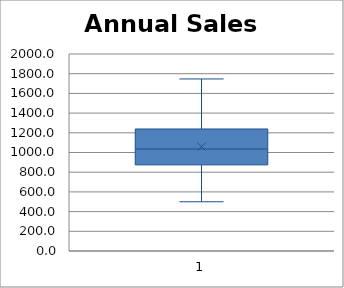
| Category | BachDeg% |
|---|---|
| 31.0 | 701.97 |
| 20.0 | 209.93 |
| 24.0 | 364.92 |
| 29.0 | 443.04 |
| 18.0 | 399.2 |
| 30.0 | 264.64 |
| 14.0 | 571.59 |
| 33.0 | 642.25 |
| 28.0 | 461.45 |
| 29.0 | 638.82 |
| 39.0 | 484.38 |
| 23.0 | 581.09 |
| 22.0 | 267.71 |
| 37.0 | 572.84 |
| 24.0 | 586.48 |
| 17.0 | 368.73 |
| 37.0 | 351.47 |
| 22.0 | 458.24 |
| 36.0 | 987.12 |
| 34.0 | 357.45 |
| 26.0 | 405.77 |
| 20.0 | 680.8 |
| 20.0 | 368.02 |
| 26.0 | 303.95 |
| 21.0 | 393.9 |
| 37.0 | 562.12 |
| 34.0 | 494.88 |
| 34.0 | 310.07 |
| 30.0 | 373.46 |
| 16.0 | 235.81 |
| 28.0 | 413.08 |
| 36.0 | 625.22 |
| 18.0 | 274.3 |
| 36.0 | 542.62 |
| 18.0 | 178.56 |
| 24.0 | 375.33 |
| 22.0 | 329.09 |
| 29.0 | 297.37 |
| 25.0 | 323.17 |
| 28.0 | 468.84 |
| 40.0 | 352.57 |
| 39.0 | 380.34 |
| 30.0 | 398.12 |
| 17.0 | 312.15 |
| 22.0 | 452.16 |
| 29.0 | 698.64 |
| 19.0 | 367.19 |
| 29.0 | 431.93 |
| 18.0 | 367.06 |
| 19.0 | 400.53 |
| 34.0 | 414.36 |
| 25.0 | 481.11 |
| 30.0 | 538.06 |
| 21.0 | 330.48 |
| 30.0 | 249.93 |
| 30.0 | 291.87 |
| 28.0 | 517.4 |
| 31.0 | 551.58 |
| 16.0 | 386.81 |
| 31.0 | 427.5 |
| 40.0 | 453.94 |
| 33.0 | 512.46 |
| 28.0 | 345.27 |
| 23.0 | 234.04 |
| 16.0 | 348.33 |
| 25.0 | 348.47 |
| 25.0 | 294.95 |
| 18.0 | 361.14 |
| 15.0 | 467.71 |
| 19.0 | 403.78 |
| 27.0 | 245.74 |
| 21.0 | 339.94 |
| 29.0 | 400.82 |
| 15.0 | 326.54 |